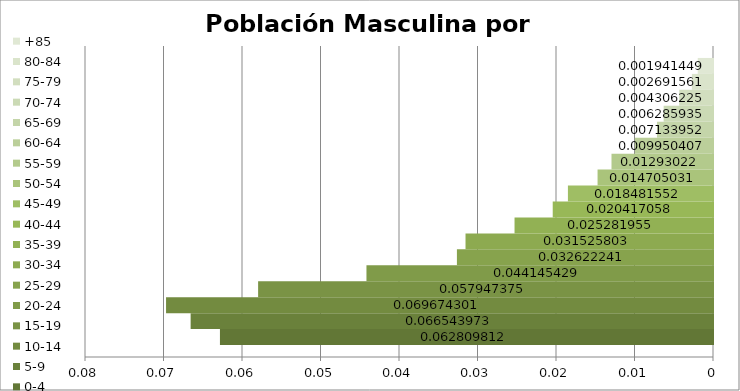
| Category | 0-4 | 5-9 | 10-14 | 15-19 | 20-24 | 25-29 | 30-34 | 35-39 | 40-44 | 45-49 | 50-54 | 55-59 | 60-64 | 65-69 | 70-74 | 75-79 | 80-84 | +85 |
|---|---|---|---|---|---|---|---|---|---|---|---|---|---|---|---|---|---|---|
| 0 | 0.063 | 0.067 | 0.07 | 0.058 | 0.044 | 0.033 | 0.032 | 0.025 | 0.02 | 0.018 | 0.015 | 0.013 | 0.01 | 0.007 | 0.006 | 0.004 | 0.003 | 0.002 |